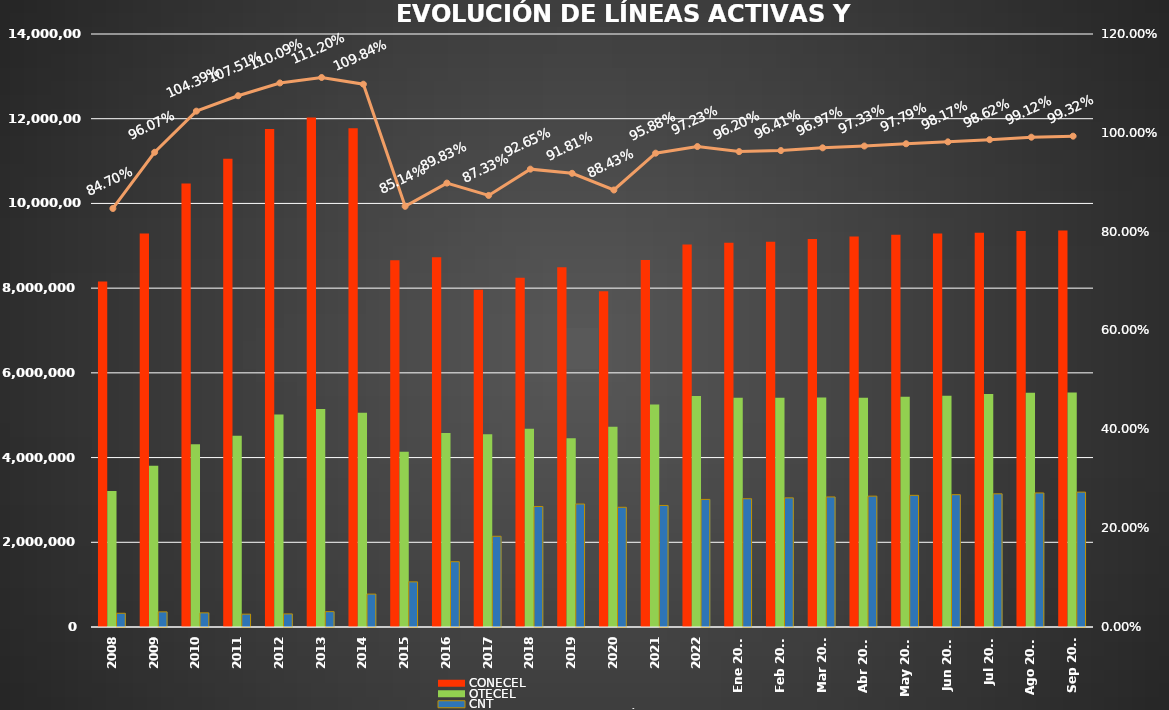
| Category | CONECEL | OTECEL | CNT |
|---|---|---|---|
| 2008 | 8156359 | 3211922 | 323967 |
| 2009 | 9291268 | 3806432 | 356900 |
| 2010 | 10470502 | 4314599 | 333730 |
| 2011 | 11057316 | 4513874 | 303368 |
| 2012 | 11757906 | 5019686 | 309271 |
| 2013 | 12030886 | 5148308 | 362560 |
| 2014 | 11772020 | 5055645 | 776892 |
| 2015 | 8658619 | 4134698 | 1065703 |
| 2016 | 8726823 | 4580092 | 1541219 |
| 2017 | 7960263 | 4549024 | 2142117 |
| 2018 | 8248050 | 4679646 | 2845142 |
| 2019 | 8493054 | 4456356 | 2903690 |
| 2020 | 7929253 | 4729725 | 2826388 |
| 2021 | 8665715 | 5254468 | 2869417 |
| 2022 | 9027737 | 5451115 | 3011899 |
| Ene 2023 | 9073421 | 5411860 | 3028254 |
| Feb 2023 | 9092490 | 5410682 | 3048837 |
| Mar 2023 | 9162562 | 5419670 | 3070611 |
| Abr 2023 | 9220042 | 5409581 | 3089410 |
| May 2023 | 9259499 | 5434175 | 3108405 |
| Jun 2023 | 9290231 | 5458655 | 3123905 |
| Jul 2023 | 9310350 | 5499232 | 3144067 |
| Ago 2023 | 9349530 | 5530451 | 3164614 |
| Sep 2023 | 9361007 | 5536629 | 3184663 |